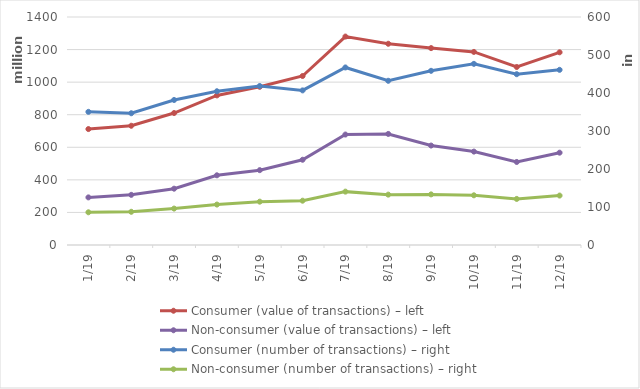
| Category | Consumer (value of transactions) – left | Non-consumer (value of transactions) – left |
|---|---|---|
| 2019-01-01 | 711926385 | 292344506 |
| 2019-02-01 | 732202511 | 307953737 |
| 2019-03-01 | 810345480 | 345795966 |
| 2019-04-01 | 918546770 | 427994005 |
| 2019-05-01 | 971493355 | 459608710 |
| 2019-06-01 | 1037709822 | 523508442 |
| 2019-07-01 | 1279840153 | 678265742 |
| 2019-08-01 | 1235675585 | 682006296 |
| 2019-09-01 | 1208971161 | 610661617 |
| 2019-10-01 | 1185647618 | 573579764 |
| 2019-11-01 | 1093097042 | 509914799 |
| 2019-12-01 | 1183230457 | 566907159 |